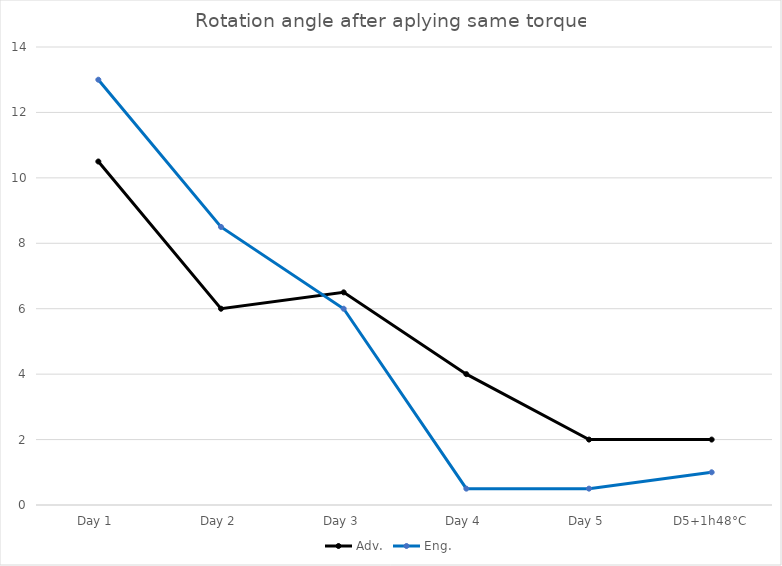
| Category | Adv. | Eng. |
|---|---|---|
| Day 1 | 10.5 | 13 |
| Day 2 | 6 | 8.5 |
| Day 3 | 6.5 | 6 |
| Day 4 | 4 | 0.5 |
| Day 5 | 2 | 0.5 |
| D5+1h48°C | 2 | 1 |